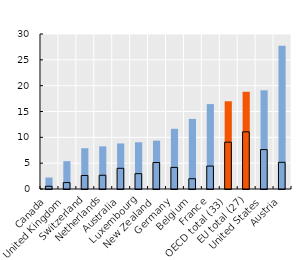
| Category | Foreign-born | Native-born |
|---|---|---|
| Canada | 2.226 | 0.532 |
| United Kingdom | 5.379 | 1.241 |
| Switzerland | 7.888 | 2.619 |
| Netherlands | 8.253 | 2.659 |
| Australia | 8.821 | 4.007 |
| Luxembourg | 9.041 | 2.969 |
| New Zealand | 9.365 | 5.127 |
| Germany | 11.652 | 4.183 |
| Belgium | 13.562 | 1.991 |
| France | 16.437 | 4.438 |
| OECD total (33) | 16.982 | 9.068 |
| EU total (27) | 18.813 | 11.068 |
| United States | 19.1 | 7.63 |
| Austria | 27.728 | 5.166 |